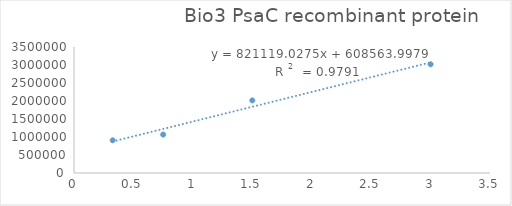
| Category | Series 0 |
|---|---|
| 3.0 | 3019429 |
| 1.5 | 2016539.23 |
| 0.75 | 1067386.1 |
| 0.325 | 908640.24 |